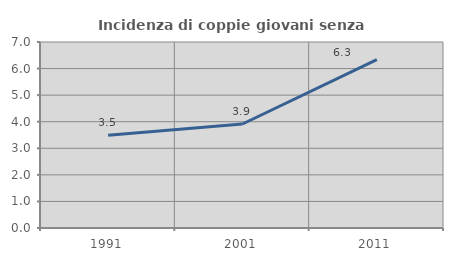
| Category | Incidenza di coppie giovani senza figli |
|---|---|
| 1991.0 | 3.488 |
| 2001.0 | 3.915 |
| 2011.0 | 6.34 |